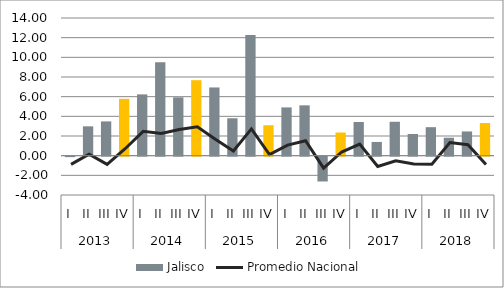
| Category | Jalisco |
|---|---|
| 0 | -0.047 |
| 1 | 2.982 |
| 2 | 3.485 |
| 3 | 5.782 |
| 4 | 6.23 |
| 5 | 9.503 |
| 6 | 5.93 |
| 7 | 7.675 |
| 8 | 6.937 |
| 9 | 3.803 |
| 10 | 12.261 |
| 11 | 3.094 |
| 12 | 4.907 |
| 13 | 5.118 |
| 14 | -2.522 |
| 15 | 2.355 |
| 16 | 3.421 |
| 17 | 1.395 |
| 18 | 3.447 |
| 19 | 2.204 |
| 20 | 2.896 |
| 21 | 1.823 |
| 22 | 2.463 |
| 23 | 3.318 |